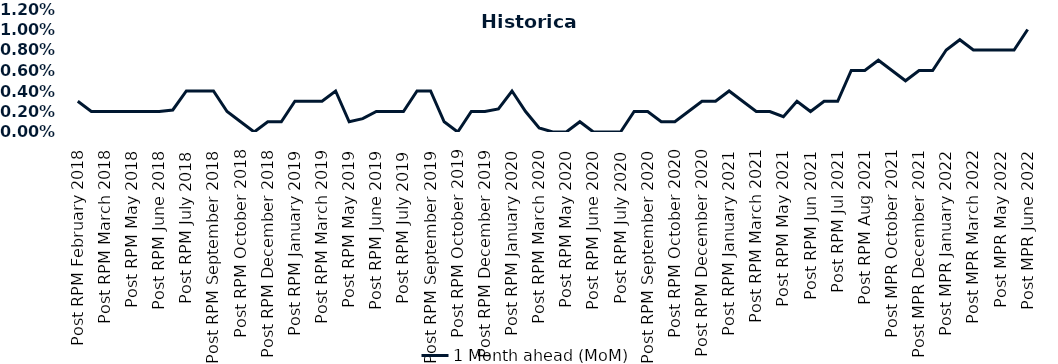
| Category | 1 Month ahead (MoM) |
|---|---|
| Post RPM February 2018 | 0.003 |
| Pre RPM March 2018 | 0.002 |
| Post RPM March 2018 | 0.002 |
| Pre RPM May 2018 | 0.002 |
| Post RPM May 2018 | 0.002 |
| Pre RPM June 2018 | 0.002 |
| Post RPM June 2018 | 0.002 |
| Pre RPM July 2018 | 0.002 |
| Post RPM July 2018 | 0.004 |
| Pre RPM September 2018 | 0.004 |
| Post RPM September 2018 | 0.004 |
| Pre RPM October 2018 | 0.002 |
| Post RPM October 2018 | 0.001 |
| Pre RPM December 2018 | 0 |
| Post RPM December 2018 | 0.001 |
| Pre RPM January 2019 | 0.001 |
| Post RPM January 2019 | 0.003 |
| Pre RPM March 2019 | 0.003 |
| Post RPM March 2019 | 0.003 |
| Pre RPM May 2019 | 0.004 |
| Post RPM May 2019 | 0.001 |
| Pre RPM June 2019 | 0.001 |
| Post RPM June 2019 | 0.002 |
| Pre RPM July 2019 | 0.002 |
| Post RPM July 2019 | 0.002 |
| Pre RPM September 2019 | 0.004 |
| Post RPM September 2019 | 0.004 |
| Pre RPM October 2019 | 0.001 |
| Post RPM October 2019 | 0 |
| Pre RPM December 2019 | 0.002 |
| Post RPM December 2019 | 0.002 |
| Pre RPM January 2020 | 0.002 |
| Post RPM January 2020 | 0.004 |
| Pre RPM March 2020 | 0.002 |
| Post RPM March 2020 | 0 |
| Pre RPM May 2020 | 0 |
| Post RPM May 2020 | 0 |
| Pre RPM June 2020 | 0.001 |
| Post RPM June 2020 | 0 |
| Pre RPM July 2020 | 0 |
| Post RPM July 2020 | 0 |
| Pre RPM September 2020 | 0.002 |
| Post RPM September 2020 | 0.002 |
| Pre RPM October 2020 | 0.001 |
| Post RPM October 2020 | 0.001 |
| Pre RPM December 2020 | 0.002 |
|  Post RPM December 2020 | 0.003 |
| Pre RPM January 2021 | 0.003 |
| Post RPM January 2021 | 0.004 |
|  Pre RPM March 2021 | 0.003 |
|  Post RPM March 2021 | 0.002 |
|  Pre RPM May 2021 | 0.002 |
|  Post RPM May 2021 | 0.002 |
|  Pre RPM Jun 2021 | 0.003 |
|   Post RPM Jun 2021 | 0.002 |
| Pre RPM Jul 2021 | 0.003 |
|  Post RPM Jul 2021 | 0.003 |
| Pre RPM Aug 2021 | 0.006 |
|  Post RPM Aug 2021 | 0.006 |
| Pre MPR October 2021 | 0.007 |
| Post MPR October 2021 | 0.006 |
| Pre MPR December 2021 | 0.005 |
| Post MPR December 2021 | 0.006 |
| Pre MPR January 2022 | 0.006 |
| Post MPR January 2022 | 0.008 |
| Pre MPR March 2022 | 0.009 |
| Post MPR March 2022 | 0.008 |
| Pre MPR May 2022 | 0.008 |
| Post MPR May 2022 | 0.008 |
| Pre MPR June 2022 | 0.008 |
| Post MPR June 2022 | 0.01 |